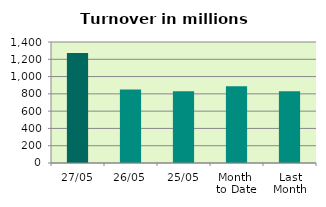
| Category | Series 0 |
|---|---|
| 27/05 | 1273.489 |
| 26/05 | 851.492 |
| 25/05 | 829.266 |
| Month 
to Date | 886.956 |
| Last
Month | 829.993 |